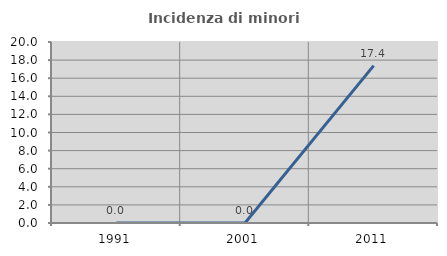
| Category | Incidenza di minori stranieri |
|---|---|
| 1991.0 | 0 |
| 2001.0 | 0 |
| 2011.0 | 17.391 |